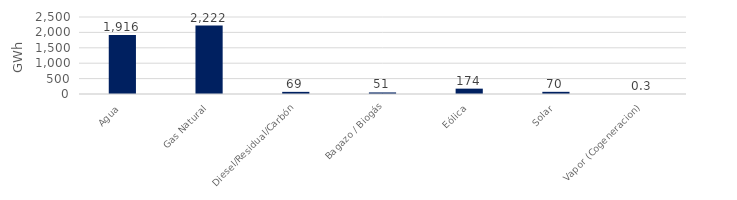
| Category | Series 0 |
|---|---|
| Agua | 1915.782 |
| Gas Natural | 2221.99 |
| Diesel/Residual/Carbón | 69.168 |
| Bagazo / Biogás | 50.986 |
| Eólica | 173.608 |
| Solar | 70.43 |
| Vapor (Cogeneracion) | 0.274 |